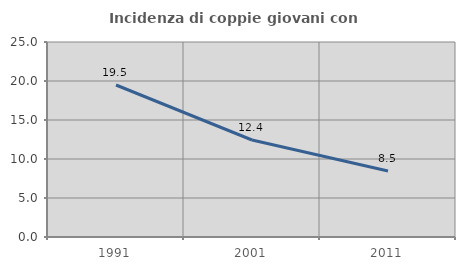
| Category | Incidenza di coppie giovani con figli |
|---|---|
| 1991.0 | 19.487 |
| 2001.0 | 12.435 |
| 2011.0 | 8.458 |